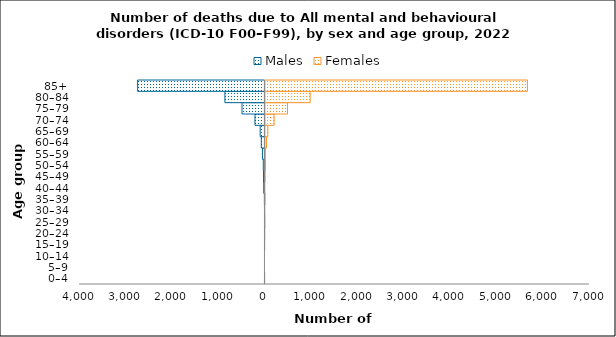
| Category | Males | Females |
|---|---|---|
| 0–4 | 0 | 1 |
| 5–9 | 0 | 0 |
| 10–14 | 0 | 0 |
| 15–19 | 0 | 1 |
| 20–24 | -2 | 0 |
| 25–29 | -2 | 2 |
| 30–34 | -6 | 2 |
| 35–39 | -11 | 11 |
| 40–44 | -26 | 8 |
| 45–49 | -31 | 11 |
| 50–54 | -36 | 23 |
| 55–59 | -54 | 18 |
| 60–64 | -79 | 44 |
| 65–69 | -103 | 73 |
| 70–74 | -215 | 208 |
| 75–79 | -495 | 498 |
| 80–84 | -864 | 986 |
| 85+ | -2746 | 5672 |